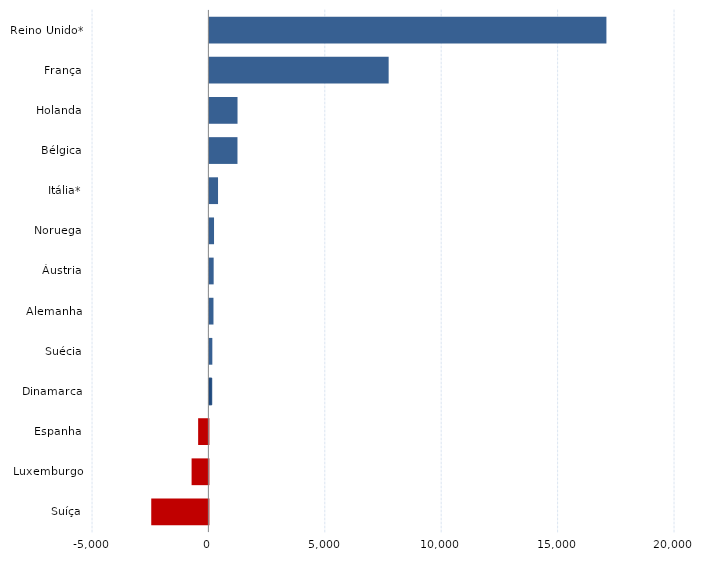
| Category | Series 0 |
|---|---|
| Suíça | -2455 |
| Luxemburgo | -722 |
| Espanha | -441 |
| Dinamarca | 99 |
| Suécia | 126 |
| Alemanha | 175 |
| Áustria | 183 |
| Noruega | 199 |
| Itália* | 371 |
| Bélgica | 1206 |
| Holanda | 1208 |
| França | 7700 |
| Reino Unido* | 17054 |